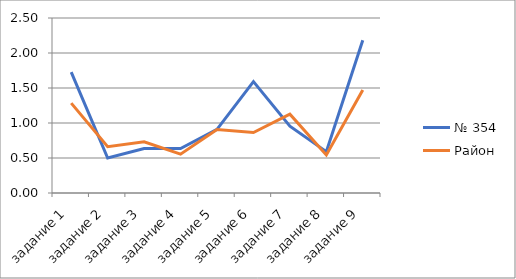
| Category | № 354 | Район |
|---|---|---|
| задание 1 | 1.727 | 1.284 |
| задание 2 | 0.5 | 0.661 |
| задание 3 | 0.636 | 0.733 |
| задание 4 | 0.636 | 0.555 |
| задание 5 | 0.909 | 0.906 |
| задание 6 | 1.591 | 0.865 |
| задание 7 | 0.955 | 1.127 |
| задание 8 | 0.591 | 0.543 |
| задание 9 | 2.182 | 1.472 |